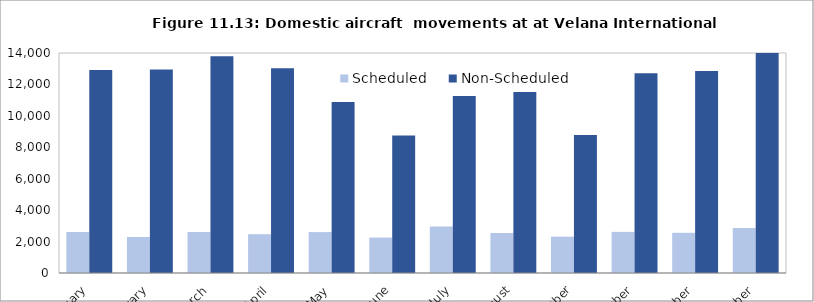
| Category | Scheduled | Non-Scheduled |
|---|---|---|
| January | 2610 | 12912 |
| February | 2290 | 12948 |
| March | 2610 | 13796 |
| April | 2470 | 13031 |
| May | 2604 | 10874 |
| June | 2254 | 8748 |
| July | 2952 | 11270 |
| August | 2544 | 11512 |
| September | 2312 | 8781 |
| October | 2618 | 12709 |
| November | 2558 | 12852 |
| December | 2856 | 14480 |